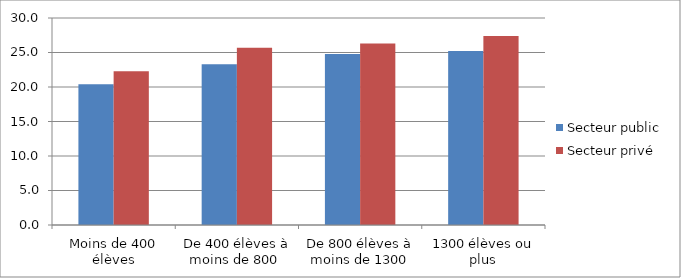
| Category | Secteur public | Secteur privé |
|---|---|---|
| Moins de 400 élèves | 20.4 | 22.3 |
| De 400 élèves à moins de 800  | 23.3 | 25.7 |
| De 800 élèves à moins de 1300 | 24.8 | 26.3 |
| 1300 élèves ou plus | 25.2 | 27.4 |